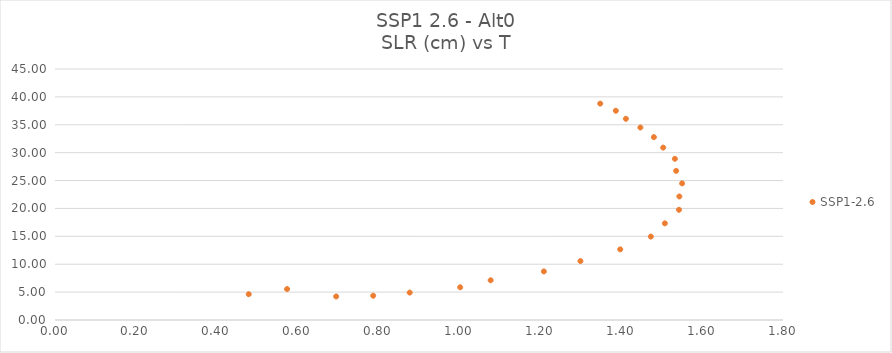
| Category | SSP1-2.6 |
|---|---|
| 0.573801925 | 5.549 |
| 0.479031654 | 4.625 |
| 0.695197934 | 4.219 |
| 0.786748548 | 4.353 |
| 0.877021499 | 4.915 |
| 1.001823785 | 5.869 |
| 1.077169017 | 7.122 |
| 1.208724293 | 8.712 |
| 1.299173185 | 10.563 |
| 1.397575444 | 12.665 |
| 1.473221374 | 14.956 |
| 1.507904093 | 17.329 |
| 1.542873968 | 19.758 |
| 1.54373516 | 22.148 |
| 1.550529426 | 24.494 |
| 1.535739785 | 26.737 |
| 1.532682879 | 28.897 |
| 1.50375724 | 30.909 |
| 1.480767226 | 32.787 |
| 1.447326891 | 34.509 |
| 1.411564052 | 36.074 |
| 1.386682925 | 37.512 |
| 1.348080905 | 38.797 |